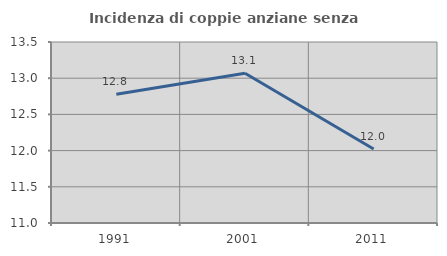
| Category | Incidenza di coppie anziane senza figli  |
|---|---|
| 1991.0 | 12.778 |
| 2001.0 | 13.068 |
| 2011.0 | 12.022 |